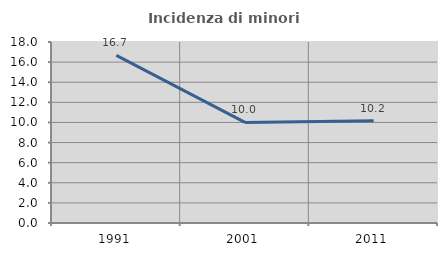
| Category | Incidenza di minori stranieri |
|---|---|
| 1991.0 | 16.667 |
| 2001.0 | 10 |
| 2011.0 | 10.169 |